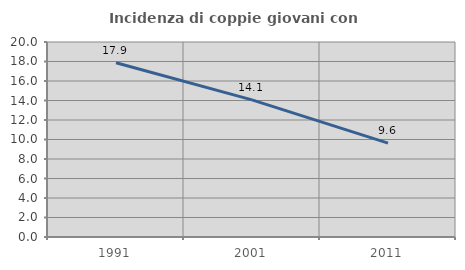
| Category | Incidenza di coppie giovani con figli |
|---|---|
| 1991.0 | 17.865 |
| 2001.0 | 14.059 |
| 2011.0 | 9.634 |